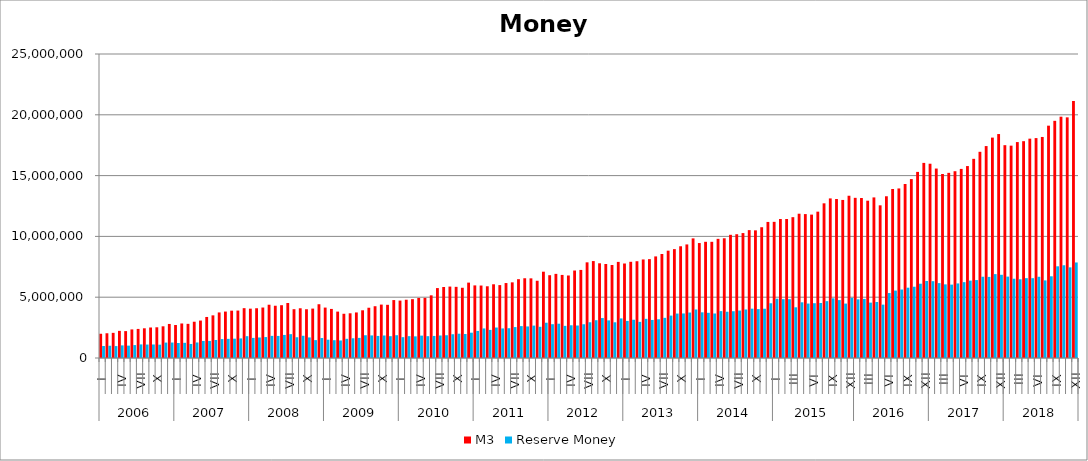
| Category | M3 | Reserve Money |
|---|---|---|
| 0 | 1993635.252 | 985529.837 |
| 1 | 2034234.826 | 1006861.291 |
| 2 | 2068041.342 | 981188.537 |
| 3 | 2231719.944 | 1037670.32 |
| 4 | 2211726.006 | 1017229.525 |
| 5 | 2350643.488 | 1063055.584 |
| 6 | 2391487.856 | 1117976.357 |
| 7 | 2443084.258 | 1106750.341 |
| 8 | 2508732.57 | 1112012.223 |
| 9 | 2525728.196 | 1095465.011 |
| 10 | 2606222.861 | 1267573.815 |
| 11 | 2799779.664 | 1272098.537 |
| 12 | 2712080.574 | 1232053.134 |
| 13 | 2839247.957 | 1248398.16 |
| 14 | 2809129.727 | 1153980.424 |
| 15 | 2983302.624 | 1277207.234 |
| 16 | 3078896.375 | 1403307.841 |
| 17 | 3374827.695 | 1404077.538 |
| 18 | 3507235.628 | 1479672.329 |
| 19 | 3747060.191 | 1555771.96 |
| 20 | 3818751.76 | 1574900.45 |
| 21 | 3892352.971 | 1588923.076 |
| 22 | 3901496.079 | 1610500.365 |
| 23 | 4098857.212 | 1793802.01 |
| 24 | 4058253.618 | 1652937.267 |
| 25 | 4091244.212 | 1686843.876 |
| 26 | 4150553.585 | 1722001.473 |
| 27 | 4381379.554 | 1820171.278 |
| 28 | 4298190.088 | 1815126.575 |
| 29 | 4341414.027 | 1897531.247 |
| 30 | 4525406.244 | 1960868.235 |
| 31 | 4014687.917 | 1706188.166 |
| 32 | 4089682.299 | 1828526.98 |
| 33 | 4009512.363 | 1691326.122 |
| 34 | 4062943.074 | 1470551.675 |
| 35 | 4421698.466 | 1642080.787 |
| 36 | 4146756.21 | 1505078.055 |
| 37 | 4035788.433 | 1464069.396 |
| 38 | 3815625.073 | 1441942.103 |
| 39 | 3637932.132 | 1578292.367 |
| 40 | 3676519.248 | 1622579.421 |
| 41 | 3746883.705 | 1654014.811 |
| 42 | 3922696.007 | 1872828.703 |
| 43 | 4133600.643 | 1856192.394 |
| 44 | 4258468.82 | 1815233.312 |
| 45 | 4392845.734 | 1850711.225 |
| 46 | 4374192.684 | 1794464.923 |
| 47 | 4763606.912 | 1874961.354 |
| 48 | 4721982.505 | 1713536.285 |
| 49 | 4792163.56 | 1796688.9 |
| 50 | 4837431.557 | 1779992.609 |
| 51 | 4938622.79 | 1840471.316 |
| 52 | 4945487.009 | 1794174.909 |
| 53 | 5154387.443 | 1814725.803 |
| 54 | 5750227.904 | 1850494.326 |
| 55 | 5840047.26 | 1871816.662 |
| 56 | 5874149.127 | 1954729.072 |
| 57 | 5852007.985 | 1997836.737 |
| 58 | 5775636.555 | 1975036.135 |
| 59 | 6199008.806 | 2081128.752 |
| 60 | 5970729.983 | 2226103.832 |
| 61 | 5959087.97 | 2430168.133 |
| 62 | 5899005.704 | 2311380.782 |
| 63 | 6062639.273 | 2505955.775 |
| 64 | 5995136.02 | 2432249.082 |
| 65 | 6164201.229 | 2448706.203 |
| 66 | 6221284.913 | 2542648.036 |
| 67 | 6481689.318 | 2621687.544 |
| 68 | 6558253.631 | 2595533.261 |
| 69 | 6550014.362 | 2664580.778 |
| 70 | 6352920.652 | 2566552.114 |
| 71 | 7097777.273 | 2901038.828 |
| 72 | 6808396.175 | 2780440.849 |
| 73 | 6918705.592 | 2819931.093 |
| 74 | 6831744.234 | 2642386.812 |
| 75 | 6785908.965 | 2691389.762 |
| 76 | 7194518.793 | 2671575.273 |
| 77 | 7242926.553 | 2775361.632 |
| 78 | 7867540.374 | 2937987.976 |
| 79 | 7971705.487 | 3107541.586 |
| 80 | 7789118.852 | 3285540.123 |
| 81 | 7732668.513 | 3094823.14 |
| 82 | 7648449.547 | 2937213.459 |
| 83 | 7903738.971 | 3255313.659 |
| 84 | 7771222.7 | 3047796.187 |
| 85 | 7912345.956 | 3146225.813 |
| 86 | 7959105.687 | 2972028.987 |
| 87 | 8103469.276 | 3220089.371 |
| 88 | 8130730.824 | 3129434.801 |
| 89 | 8354699.149 | 3184262.276 |
| 90 | 8553410.296 | 3302037.366 |
| 91 | 8826582.176 | 3487678.696 |
| 92 | 8953801.477 | 3655478.769 |
| 93 | 9188613.332 | 3663277.537 |
| 94 | 9339568.079 | 3737236.26 |
| 95 | 9836618.601 | 3989083.317 |
| 96 | 9453972.937 | 3756141.816 |
| 97 | 9556546.423 | 3717320.784 |
| 98 | 9555304.952 | 3659706.219 |
| 99 | 9799048.091 | 3855909.639 |
| 100 | 9846212.502 | 3804159.071 |
| 101 | 10130909.316 | 3846993.656 |
| 102 | 10178205.898 | 3901000.343 |
| 103 | 10273632.539 | 3988861.155 |
| 104 | 10516743.129 | 4056513.111 |
| 105 | 10497444.423 | 4020878.96 |
| 106 | 10754604.791 | 4050811.645 |
| 107 | 11189835.906 | 4501009.92 |
| 108 | 11197675.774 | 4875122.328 |
| 109 | 11430746.277 | 4837812.334 |
| 110 | 11430746.277 | 4837812.334 |
| 111 | 11581239.857 | 4169036.036 |
| 112 | 11865515.017 | 4580597.986 |
| 113 | 11835307.744 | 4478239.223 |
| 114 | 11792213.073 | 4505863.791 |
| 115 | 12034462.526 | 4525163.426 |
| 116 | 12720190.151 | 4674624.879 |
| 117 | 13124203.995 | 4907397.413 |
| 118 | 13073662.228 | 4763122.409 |
| 119 | 12998223.563 | 4474717.337 |
| 120 | 13343921.268 | 4948158.146 |
| 121 | 13172033.37 | 4823667.329 |
| 122 | 13155832.444 | 4858795.624 |
| 123 | 12936581.332 | 4553776.684 |
| 124 | 13206213.457 | 4606530.89 |
| 125 | 12555625.602 | 4388431.419 |
| 126 | 13300944.539 | 5343112.251 |
| 127 | 13897993.631 | 5546009.052 |
| 128 | 13943466.797 | 5631585.796 |
| 129 | 14309304.721 | 5782125.992 |
| 130 | 14713510.721 | 5860814.898 |
| 131 | 15304596.052 | 6108426.466 |
| 132 | 16045200.01 | 6332535.477 |
| 133 | 15976224.093 | 6317838.859 |
| 134 | 15580104.218 | 6159989.306 |
| 135 | 15132806.692 | 6056015.159 |
| 136 | 15226347.996 | 6034338.878 |
| 137 | 15360147.87 | 6133256.108 |
| 138 | 15550758.151 | 6238062.995 |
| 139 | 15785246.683 | 6363688.254 |
| 140 | 16378805.759 | 6408158.005 |
| 141 | 16957721.336 | 6683210.873 |
| 142 | 17429301.938 | 6668622.166 |
| 143 | 18125077.324 | 6898984.047 |
| 144 | 18416278.044 | 6842923.373 |
| 145 | 17501935.182 | 6693637.928 |
| 146 | 17463278.92 | 6517959.429 |
| 147 | 17756925.753 | 6474034.831 |
| 148 | 17830710.048 | 6565140.29 |
| 149 | 18037847.494 | 6564370.705 |
| 150 | 18084477.007 | 6679239.605 |
| 151 | 18177750.876 | 6382996.535 |
| 152 | 19106163.443 | 6719330.301 |
| 153 | 19504220.662 | 7540075.346 |
| 154 | 19844384.427 | 7626348.916 |
| 155 | 19790399 | 7454554.982 |
| 156 | 21124724.422 | 7856508.693 |